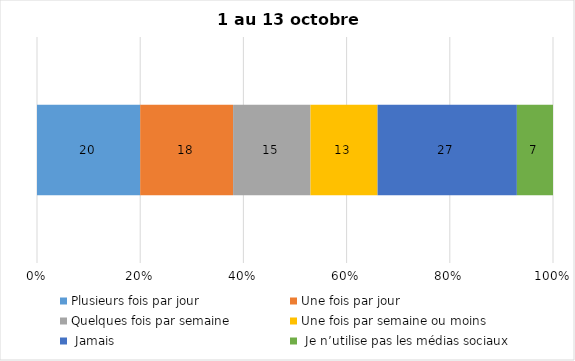
| Category | Plusieurs fois par jour | Une fois par jour | Quelques fois par semaine   | Une fois par semaine ou moins   |  Jamais   |  Je n’utilise pas les médias sociaux |
|---|---|---|---|---|---|---|
| 0 | 20 | 18 | 15 | 13 | 27 | 7 |